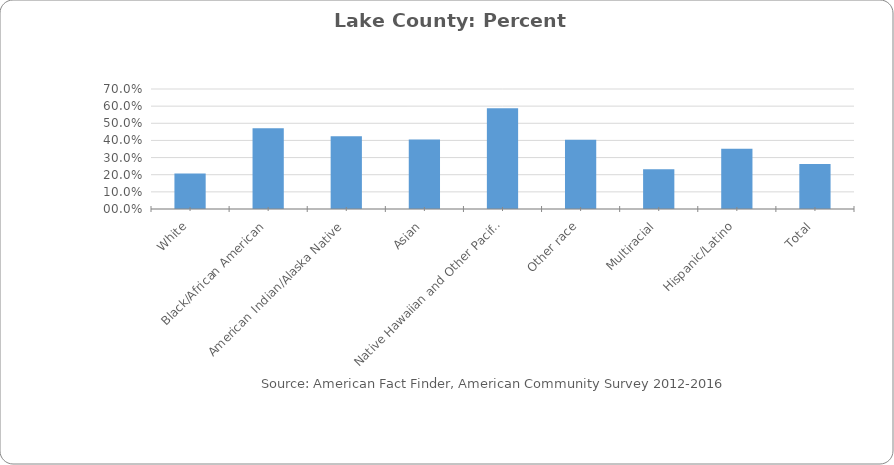
| Category | Percent Population below Poverty Level in Lake County |
|---|---|
| White | 0.207 |
| Black/African American | 0.472 |
| American Indian/Alaska Native | 0.424 |
| Asian | 0.405 |
|  Native Hawaiian and Other Pacific Islander | 0.588 |
| Other race | 0.405 |
| Multiracial | 0.232 |
| Hispanic/Latino | 0.352 |
| Total | 0.263 |